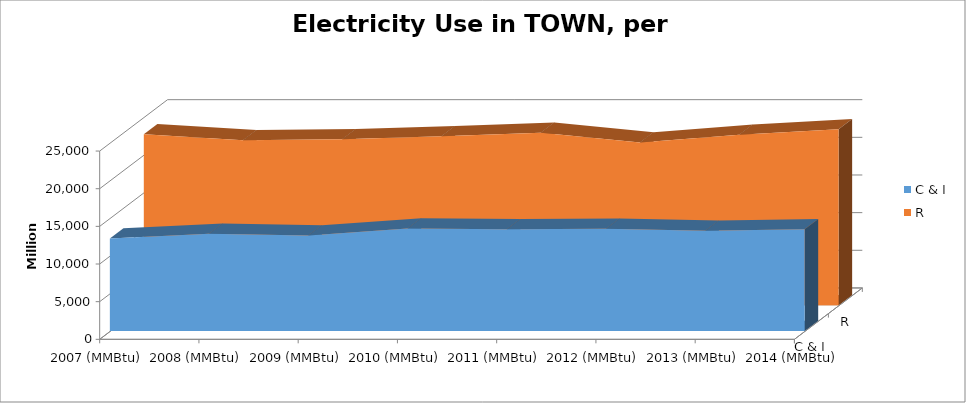
| Category | C & I | R |
|---|---|---|
| 2007 (MMBtu) | 12293.189 | 22706.742 |
| 2008 (MMBtu) | 12919.709 | 21929.802 |
| 2009 (MMBtu) | 12671.352 | 22033.982 |
| 2010 (MMBtu) | 13600.904 | 22461.733 |
| 2011 (MMBtu) | 13502.487 | 22913.113 |
| 2012 (MMBtu) | 13564.138 | 21621.807 |
| 2013 (MMBtu) | 13307.623 | 22646.801 |
| 2014 (MMBtu) | 13502.03 | 23368.318 |